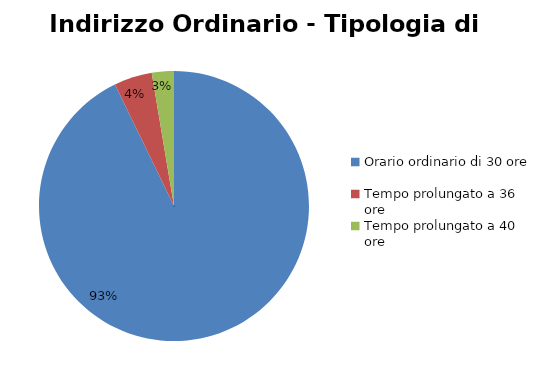
| Category | Series 0 |
|---|---|
| Orario ordinario di 30 ore | 32734 |
| Tempo prolungato a 36 ore | 1609 |
| Tempo prolungato a 40 ore | 932 |